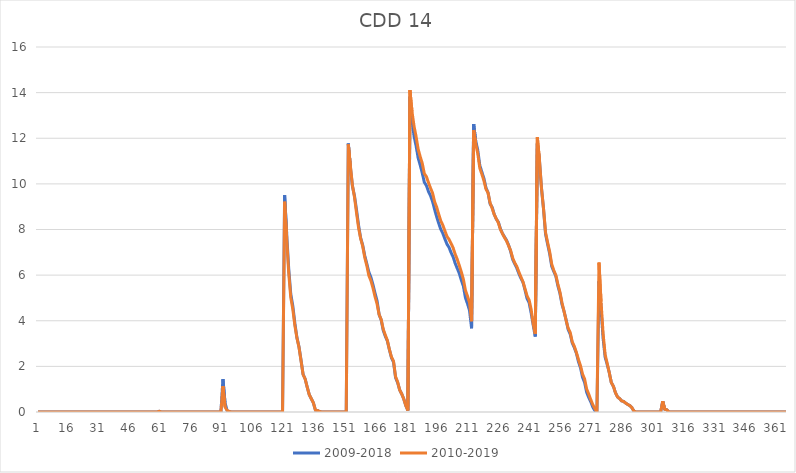
| Category | 2009-2018 | 2010-2019 |
|---|---|---|
| 0 | 0 | 0 |
| 1 | 0 | 0 |
| 2 | 0 | 0 |
| 3 | 0 | 0 |
| 4 | 0 | 0 |
| 5 | 0 | 0 |
| 6 | 0 | 0 |
| 7 | 0 | 0 |
| 8 | 0 | 0 |
| 9 | 0 | 0 |
| 10 | 0 | 0 |
| 11 | 0 | 0 |
| 12 | 0 | 0 |
| 13 | 0 | 0 |
| 14 | 0 | 0 |
| 15 | 0 | 0 |
| 16 | 0 | 0 |
| 17 | 0 | 0 |
| 18 | 0 | 0 |
| 19 | 0 | 0 |
| 20 | 0 | 0 |
| 21 | 0 | 0 |
| 22 | 0 | 0 |
| 23 | 0 | 0 |
| 24 | 0 | 0 |
| 25 | 0 | 0 |
| 26 | 0 | 0 |
| 27 | 0 | 0 |
| 28 | 0 | 0 |
| 29 | 0 | 0 |
| 30 | 0 | 0 |
| 31 | 0 | 0 |
| 32 | 0 | 0 |
| 33 | 0 | 0 |
| 34 | 0 | 0 |
| 35 | 0 | 0 |
| 36 | 0 | 0 |
| 37 | 0 | 0 |
| 38 | 0 | 0 |
| 39 | 0 | 0 |
| 40 | 0 | 0 |
| 41 | 0 | 0 |
| 42 | 0 | 0 |
| 43 | 0 | 0 |
| 44 | 0 | 0 |
| 45 | 0 | 0 |
| 46 | 0 | 0 |
| 47 | 0 | 0 |
| 48 | 0 | 0 |
| 49 | 0 | 0 |
| 50 | 0 | 0 |
| 51 | 0 | 0 |
| 52 | 0 | 0 |
| 53 | 0 | 0 |
| 54 | 0 | 0 |
| 55 | 0 | 0 |
| 56 | 0 | 0 |
| 57 | 0 | 0 |
| 58 | 0 | 0 |
| 59 | 0.03 | 0.03 |
| 60 | 0 | 0 |
| 61 | 0 | 0 |
| 62 | 0 | 0 |
| 63 | 0 | 0 |
| 64 | 0 | 0 |
| 65 | 0 | 0 |
| 66 | 0 | 0 |
| 67 | 0 | 0 |
| 68 | 0 | 0 |
| 69 | 0 | 0 |
| 70 | 0 | 0 |
| 71 | 0 | 0 |
| 72 | 0 | 0 |
| 73 | 0 | 0 |
| 74 | 0 | 0 |
| 75 | 0 | 0 |
| 76 | 0 | 0 |
| 77 | 0 | 0 |
| 78 | 0 | 0 |
| 79 | 0 | 0 |
| 80 | 0 | 0 |
| 81 | 0 | 0 |
| 82 | 0 | 0 |
| 83 | 0 | 0 |
| 84 | 0 | 0 |
| 85 | 0 | 0 |
| 86 | 0 | 0 |
| 87 | 0 | 0 |
| 88 | 0 | 0 |
| 89 | 0 | 0 |
| 90 | 1.44 | 1.13 |
| 91 | 0.41 | 0.22 |
| 92 | 0.07 | 0.07 |
| 93 | 0.03 | 0.03 |
| 94 | 0 | 0 |
| 95 | 0 | 0 |
| 96 | 0 | 0 |
| 97 | 0 | 0 |
| 98 | 0 | 0 |
| 99 | 0 | 0 |
| 100 | 0 | 0 |
| 101 | 0 | 0 |
| 102 | 0 | 0 |
| 103 | 0 | 0 |
| 104 | 0 | 0 |
| 105 | 0 | 0 |
| 106 | 0 | 0 |
| 107 | 0 | 0 |
| 108 | 0 | 0 |
| 109 | 0 | 0 |
| 110 | 0 | 0 |
| 111 | 0 | 0 |
| 112 | 0 | 0 |
| 113 | 0 | 0 |
| 114 | 0 | 0 |
| 115 | 0 | 0 |
| 116 | 0 | 0 |
| 117 | 0 | 0 |
| 118 | 0 | 0 |
| 119 | 0 | 0 |
| 120 | 9.51 | 9.22 |
| 121 | 7.83 | 7.63 |
| 122 | 6.29 | 6.1 |
| 123 | 5.17 | 5.02 |
| 124 | 4.65 | 4.5 |
| 125 | 3.89 | 3.79 |
| 126 | 3.26 | 3.25 |
| 127 | 2.86 | 2.84 |
| 128 | 2.27 | 2.25 |
| 129 | 1.65 | 1.64 |
| 130 | 1.45 | 1.45 |
| 131 | 1.09 | 1.09 |
| 132 | 0.76 | 0.76 |
| 133 | 0.58 | 0.58 |
| 134 | 0.4 | 0.4 |
| 135 | 0.08 | 0.08 |
| 136 | 0.07 | 0.07 |
| 137 | 0.02 | 0.02 |
| 138 | 0 | 0 |
| 139 | 0 | 0 |
| 140 | 0 | 0 |
| 141 | 0 | 0 |
| 142 | 0 | 0 |
| 143 | 0 | 0 |
| 144 | 0 | 0 |
| 145 | 0 | 0 |
| 146 | 0 | 0 |
| 147 | 0 | 0 |
| 148 | 0 | 0 |
| 149 | 0 | 0 |
| 150 | 0 | 0 |
| 151 | 11.77 | 11.73 |
| 152 | 10.76 | 10.8 |
| 153 | 9.9 | 9.94 |
| 154 | 9.48 | 9.43 |
| 155 | 8.86 | 8.73 |
| 156 | 8.19 | 8.08 |
| 157 | 7.63 | 7.61 |
| 158 | 7.32 | 7.27 |
| 159 | 6.86 | 6.78 |
| 160 | 6.5 | 6.42 |
| 161 | 6.13 | 5.98 |
| 162 | 5.91 | 5.76 |
| 163 | 5.58 | 5.44 |
| 164 | 5.21 | 5.06 |
| 165 | 4.87 | 4.74 |
| 166 | 4.27 | 4.27 |
| 167 | 4.04 | 4.06 |
| 168 | 3.58 | 3.63 |
| 169 | 3.32 | 3.38 |
| 170 | 3.12 | 3.14 |
| 171 | 2.73 | 2.74 |
| 172 | 2.38 | 2.41 |
| 173 | 2.19 | 2.23 |
| 174 | 1.51 | 1.55 |
| 175 | 1.29 | 1.32 |
| 176 | 0.97 | 0.97 |
| 177 | 0.79 | 0.79 |
| 178 | 0.57 | 0.57 |
| 179 | 0.28 | 0.28 |
| 180 | 0.07 | 0.07 |
| 181 | 13.82 | 14.11 |
| 182 | 12.8 | 13.17 |
| 183 | 12.09 | 12.53 |
| 184 | 11.66 | 12.07 |
| 185 | 11.13 | 11.52 |
| 186 | 10.82 | 11.19 |
| 187 | 10.47 | 10.9 |
| 188 | 10.07 | 10.45 |
| 189 | 9.93 | 10.32 |
| 190 | 9.67 | 10.06 |
| 191 | 9.48 | 9.82 |
| 192 | 9.23 | 9.6 |
| 193 | 8.88 | 9.22 |
| 194 | 8.56 | 8.98 |
| 195 | 8.27 | 8.67 |
| 196 | 8.01 | 8.38 |
| 197 | 7.83 | 8.19 |
| 198 | 7.59 | 7.94 |
| 199 | 7.36 | 7.7 |
| 200 | 7.22 | 7.57 |
| 201 | 6.99 | 7.39 |
| 202 | 6.8 | 7.2 |
| 203 | 6.52 | 6.92 |
| 204 | 6.3 | 6.7 |
| 205 | 6.08 | 6.43 |
| 206 | 5.78 | 6.14 |
| 207 | 5.52 | 5.82 |
| 208 | 5.01 | 5.34 |
| 209 | 4.75 | 5.08 |
| 210 | 4.45 | 4.8 |
| 211 | 3.67 | 3.98 |
| 212 | 12.62 | 12.36 |
| 213 | 11.9 | 11.77 |
| 214 | 11.48 | 11.33 |
| 215 | 10.81 | 10.69 |
| 216 | 10.52 | 10.43 |
| 217 | 10.24 | 10.14 |
| 218 | 9.83 | 9.77 |
| 219 | 9.62 | 9.61 |
| 220 | 9.12 | 9.17 |
| 221 | 8.98 | 8.93 |
| 222 | 8.67 | 8.66 |
| 223 | 8.46 | 8.47 |
| 224 | 8.33 | 8.3 |
| 225 | 8.04 | 8.01 |
| 226 | 7.83 | 7.82 |
| 227 | 7.68 | 7.65 |
| 228 | 7.53 | 7.5 |
| 229 | 7.32 | 7.29 |
| 230 | 7.04 | 7.08 |
| 231 | 6.69 | 6.75 |
| 232 | 6.49 | 6.54 |
| 233 | 6.31 | 6.38 |
| 234 | 6.07 | 6.14 |
| 235 | 5.86 | 5.92 |
| 236 | 5.69 | 5.71 |
| 237 | 5.35 | 5.4 |
| 238 | 4.97 | 5.09 |
| 239 | 4.79 | 4.91 |
| 240 | 4.33 | 4.49 |
| 241 | 3.8 | 3.86 |
| 242 | 3.31 | 3.42 |
| 243 | 11.77 | 12.04 |
| 244 | 11.06 | 11.08 |
| 245 | 9.82 | 9.84 |
| 246 | 8.91 | 8.93 |
| 247 | 7.8 | 7.87 |
| 248 | 7.36 | 7.43 |
| 249 | 6.94 | 7.02 |
| 250 | 6.38 | 6.48 |
| 251 | 6.16 | 6.21 |
| 252 | 5.95 | 6 |
| 253 | 5.53 | 5.61 |
| 254 | 5.2 | 5.26 |
| 255 | 4.72 | 4.79 |
| 256 | 4.41 | 4.41 |
| 257 | 4.04 | 4.02 |
| 258 | 3.61 | 3.67 |
| 259 | 3.41 | 3.49 |
| 260 | 3.02 | 3.07 |
| 261 | 2.82 | 2.88 |
| 262 | 2.58 | 2.61 |
| 263 | 2.21 | 2.3 |
| 264 | 1.94 | 2.03 |
| 265 | 1.52 | 1.66 |
| 266 | 1.3 | 1.45 |
| 267 | 0.86 | 1.01 |
| 268 | 0.64 | 0.79 |
| 269 | 0.45 | 0.54 |
| 270 | 0.21 | 0.32 |
| 271 | 0.06 | 0.14 |
| 272 | 0 | 0 |
| 273 | 5.73 | 6.55 |
| 274 | 4.52 | 4.84 |
| 275 | 3.23 | 3.44 |
| 276 | 2.4 | 2.51 |
| 277 | 2.08 | 2.13 |
| 278 | 1.73 | 1.73 |
| 279 | 1.29 | 1.29 |
| 280 | 1.13 | 1.13 |
| 281 | 0.85 | 0.85 |
| 282 | 0.66 | 0.66 |
| 283 | 0.59 | 0.59 |
| 284 | 0.49 | 0.49 |
| 285 | 0.46 | 0.46 |
| 286 | 0.39 | 0.39 |
| 287 | 0.33 | 0.33 |
| 288 | 0.28 | 0.28 |
| 289 | 0.19 | 0.19 |
| 290 | 0.04 | 0.04 |
| 291 | 0 | 0 |
| 292 | 0 | 0 |
| 293 | 0 | 0 |
| 294 | 0 | 0 |
| 295 | 0 | 0 |
| 296 | 0 | 0 |
| 297 | 0 | 0 |
| 298 | 0 | 0 |
| 299 | 0 | 0 |
| 300 | 0 | 0 |
| 301 | 0 | 0 |
| 302 | 0 | 0 |
| 303 | 0 | 0 |
| 304 | 0.47 | 0.47 |
| 305 | 0.12 | 0.12 |
| 306 | 0.1 | 0.1 |
| 307 | 0 | 0 |
| 308 | 0 | 0 |
| 309 | 0 | 0 |
| 310 | 0 | 0 |
| 311 | 0 | 0 |
| 312 | 0 | 0 |
| 313 | 0 | 0 |
| 314 | 0 | 0 |
| 315 | 0 | 0 |
| 316 | 0 | 0 |
| 317 | 0 | 0 |
| 318 | 0 | 0 |
| 319 | 0 | 0 |
| 320 | 0 | 0 |
| 321 | 0 | 0 |
| 322 | 0 | 0 |
| 323 | 0 | 0 |
| 324 | 0 | 0 |
| 325 | 0 | 0 |
| 326 | 0 | 0 |
| 327 | 0 | 0 |
| 328 | 0 | 0 |
| 329 | 0 | 0 |
| 330 | 0 | 0 |
| 331 | 0 | 0 |
| 332 | 0 | 0 |
| 333 | 0 | 0 |
| 334 | 0 | 0 |
| 335 | 0 | 0 |
| 336 | 0 | 0 |
| 337 | 0 | 0 |
| 338 | 0 | 0 |
| 339 | 0 | 0 |
| 340 | 0 | 0 |
| 341 | 0 | 0 |
| 342 | 0 | 0 |
| 343 | 0 | 0 |
| 344 | 0 | 0 |
| 345 | 0 | 0 |
| 346 | 0 | 0 |
| 347 | 0 | 0 |
| 348 | 0 | 0 |
| 349 | 0 | 0 |
| 350 | 0 | 0 |
| 351 | 0 | 0 |
| 352 | 0 | 0 |
| 353 | 0 | 0 |
| 354 | 0 | 0 |
| 355 | 0 | 0 |
| 356 | 0 | 0 |
| 357 | 0 | 0 |
| 358 | 0 | 0 |
| 359 | 0 | 0 |
| 360 | 0 | 0 |
| 361 | 0 | 0 |
| 362 | 0 | 0 |
| 363 | 0 | 0 |
| 364 | 0 | 0 |